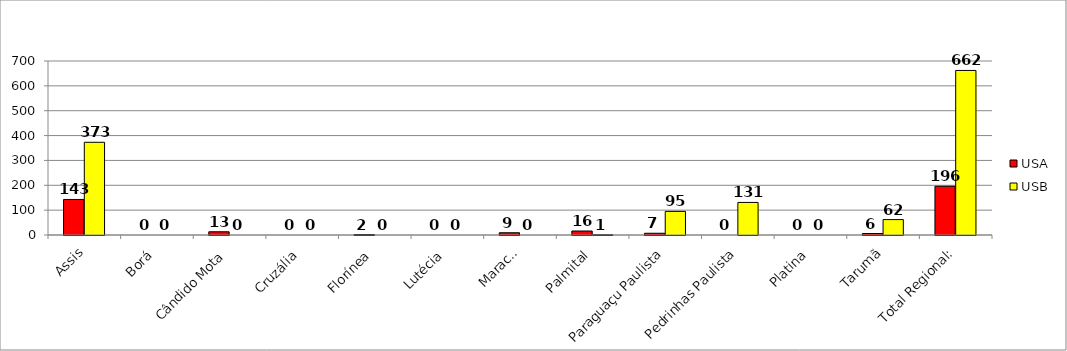
| Category | USA | USB |
|---|---|---|
| Assis | 143 | 373 |
| Borá | 0 | 0 |
| Cândido Mota | 13 | 0 |
| Cruzália | 0 | 0 |
| Florínea | 2 | 0 |
| Lutécia | 0 | 0 |
| Maracaí | 9 | 0 |
| Palmital | 16 | 1 |
| Paraguaçu Paulista | 7 | 95 |
| Pedrinhas Paulista | 0 | 131 |
| Platina | 0 | 0 |
| Tarumã | 6 | 62 |
| Total Regional: | 196 | 662 |